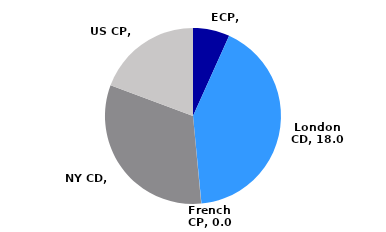
| Category | Series 0 |
|---|---|
| ECP | 2.913 |
| London CD | 18.048 |
| French CP | 0.02 |
| NY CD | 13.91 |
| US CP | 8.355 |